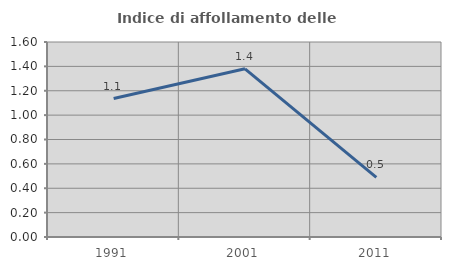
| Category | Indice di affollamento delle abitazioni  |
|---|---|
| 1991.0 | 1.136 |
| 2001.0 | 1.38 |
| 2011.0 | 0.489 |